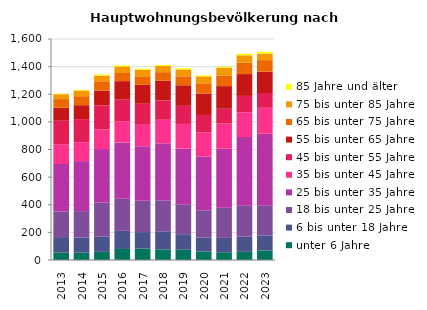
| Category | unter 6 Jahre | 6 bis unter 18 Jahre | 18 bis unter 25 Jahre | 25 bis unter 35 Jahre | 35 bis unter 45 Jahre | 45 bis unter 55 Jahre | 55 bis unter 65 Jahre | 65 bis unter 75 Jahre | 75 bis unter 85 Jahre | 85 Jahre und älter |
|---|---|---|---|---|---|---|---|---|---|---|
| 2013.0 | 53 | 113 | 185 | 344 | 140 | 173 | 95 | 62 | 35 | 5 |
| 2014.0 | 53 | 110 | 191 | 362 | 137 | 167 | 101 | 65 | 41 | 5 |
| 2015.0 | 59 | 110 | 248 | 386 | 143 | 173 | 107 | 68 | 41 | 8 |
| 2016.0 | 80 | 131 | 233 | 407 | 152 | 161 | 131 | 59 | 47 | 8 |
| 2017.0 | 83 | 119 | 227 | 395 | 155 | 152 | 137 | 62 | 47 | 8 |
| 2018.0 | 77 | 131 | 224 | 413 | 170 | 140 | 143 | 62 | 44 | 8 |
| 2019.0 | 74 | 113 | 215 | 404 | 179 | 131 | 149 | 65 | 50 | 8 |
| 2020.0 | 62 | 101 | 197 | 389 | 176 | 125 | 155 | 74 | 50 | 8 |
| 2021.0 | 56 | 104 | 218 | 428 | 182 | 107 | 164 | 77 | 56 | 8 |
| 2022.0 | 59 | 110 | 224 | 497 | 179 | 119 | 158 | 83 | 53 | 11 |
| 2023.0 | 68 | 110 | 215 | 521 | 188 | 107 | 155 | 83 | 47 | 14 |